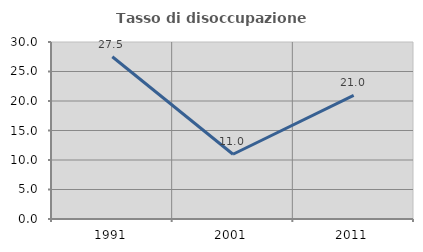
| Category | Tasso di disoccupazione giovanile  |
|---|---|
| 1991.0 | 27.5 |
| 2001.0 | 10.976 |
| 2011.0 | 20.968 |